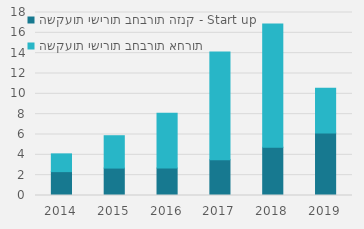
| Category | השקעות ישירות בחברות הזנק - Start up | השקעות ישירות בחברות אחרות |
|---|---|---|
| 2014 | 2347.742 | 1747.895 |
| 2015 | 2696.706 | 3183.555 |
| 2016 | 2698.547 | 5399.621 |
| 2017 | 3515.763 | 10589.22 |
| 2018 | 4751.049 | 12114.385 |
| 2019 | 6143.128 | 4405.633 |